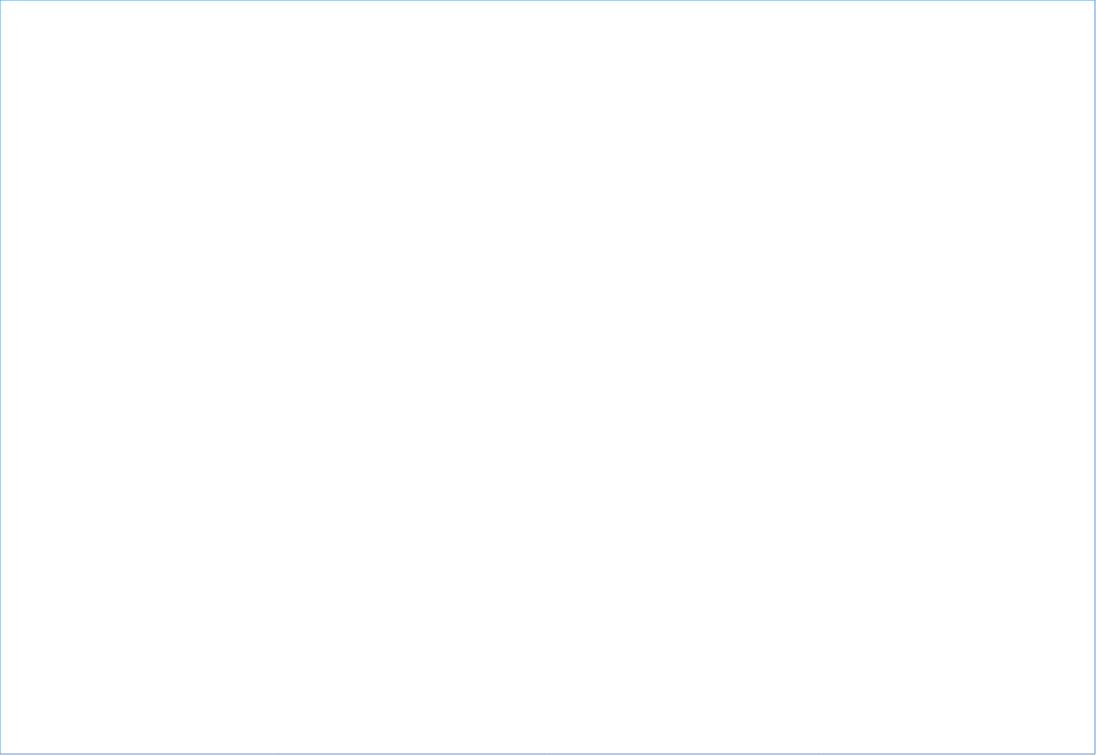
| Category | Total Population | # of People adopt basic personal and community hygiene practices | # of people access to functioning  sanitation facilities | # of people Equitable and continuous access to sufficient quantity of domestic water |
|---|---|---|---|---|
| Baw Du Pha Village | 1435 | 0 | 792 | 1435 |
| Bu May Ohn Daw Chay | 4476 | 0 | 1302 | 4476 |
| Chaung New Min Gan | 1083 | 0 | 672 | 1083 |
| Dar Paing Ywar Haung | 1867 | 0 | 1260 | 1867 |
| Dar Paing Ywar Thit | 3768 | 0 | 1194 | 3768 |
| Kan Pyin Ywa Haung | 373 | 0 | 264 | 373 |
| Kan Pyin Ywar Thit | 481 | 0 | 402 | 481 |
| Kha Tin Paik | 2168 | 0 | 1296 | 2168 |
| Koe Saung (1) village | 715 | 0 | 715 | 715 |
| Kyan Taw | 656 | 0 | 468 | 656 |
| Kyar Ma Thauk | 1117 | 0 | 1117 | 1117 |
| Kyauk Tan Chay | 741 | 0 | 738 | 741 |
| Kyauk Tan Gyi | 978 | 0 | 708 | 978 |
| Maung Ni Pyin | 1027 | 0 | 396 | 1027 |
| Ohn Ye Paw | 369 | 0 | 348 | 369 |
| Pyar Lay Chaung Ywar Haung | 370 | 0 | 370 | 370 |
| Pyin Shey Ku lar | 1369 | 0 | 1314 | 1369 |
| Sa Ma Nya Village | 1750 | 0 | 1188 | 1750 |
| Thein Tan | 658 | 0 | 588 | 658 |
| Thet Kay Pyin | 12993 | 0 | 1308 | 12993 |
| Thin Ga Net | 1901 | 0 | 0 | 0 |
| Thin Pone Tan | 1574 | 0 | 816 | 1574 |
| Thone Saung | 454 | 0 | 454 | 454 |
| Yae Chan Pyin | 1529 | 0 | 1116 | 1529 |
| Ywar Thar Yar | 1473 | 0 | 474 | 1473 |